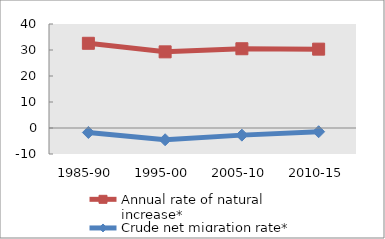
| Category | Annual rate of natural increase* | Crude net migration rate* |
|---|---|---|
| 1985-90 | 32.583 | -1.729 |
| 1995-00 | 29.29 | -4.52 |
| 2005-10 | 30.482 | -2.742 |
| 2010-15 | 30.33 | -1.433 |